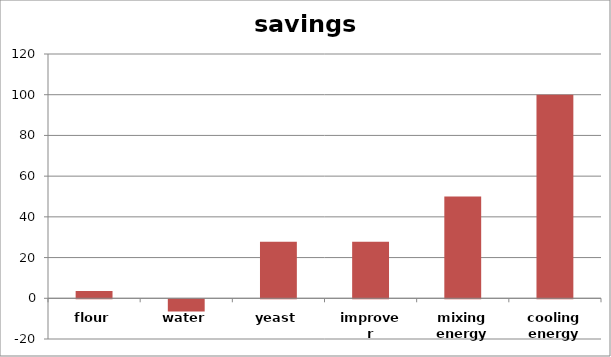
| Category | savings [%] |
|---|---|
| flour | 3.614 |
| water | -6.024 |
| yeast | 27.711 |
| improver | 27.711 |
| mixing energy | 50 |
| cooling energy | 100 |